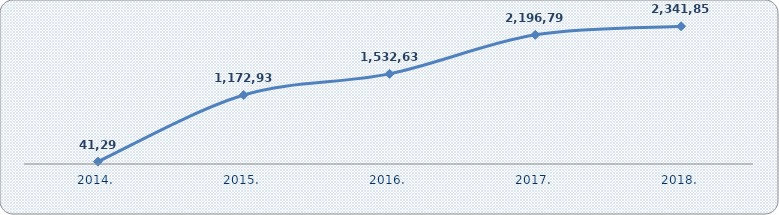
| Category | Dobit ili gubitak razdoblja  |
|---|---|
| 2014. | 41297.498 |
| 2015. | 1172934.297 |
| 2016. | 1532629.599 |
| 2017. | 2196795.191 |
| 2018. | 2341855.71 |